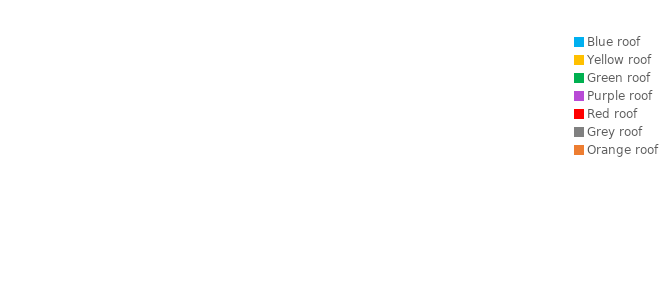
| Category | Series 0 |
|---|---|
| Blue roof | 0 |
| Yellow roof | 0 |
| Green roof | 0 |
| Purple roof | 0 |
| Red roof | 0 |
| Grey roof | 0 |
| Orange roof | 0 |